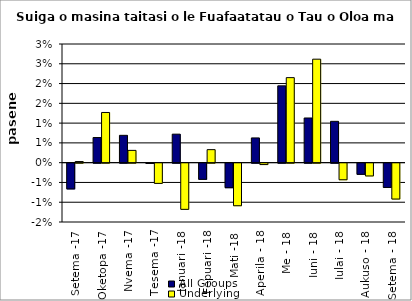
| Category | All Groups | Underlying |
|---|---|---|
| Setema -17 | -0.007 | 0 |
| Oketopa -17 | 0.006 | 0.013 |
| Nvema -17 | 0.007 | 0.003 |
| Tesema -17 | 0 | -0.005 |
| Ianuari -18 | 0.007 | -0.012 |
| Fepuari -18 | -0.004 | 0.003 |
| Mati -18 | -0.006 | -0.011 |
| Aperila - 18 | 0.006 | 0 |
| Me - 18 | 0.019 | 0.021 |
| Iuni - 18 | 0.011 | 0.026 |
| Iulai - 18 | 0.01 | -0.004 |
| Aukuso - 18 | -0.003 | -0.003 |
| Setema - 18 | -0.006 | -0.009 |